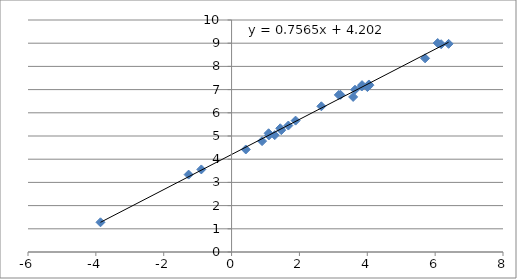
| Category | Series 0 |
|---|---|
| -3.863232841258714 | 1.281 |
| -1.2658482080440236 | 3.336 |
| -0.8915981192837836 | 3.558 |
| 1.091923300517313 | 5.118 |
| 0.41871033485818504 | 4.419 |
| 0.9001613499442714 | 4.779 |
| 1.2725655957915476 | 5.037 |
| 1.4655675420143985 | 5.252 |
| 1.673351238177753 | 5.451 |
| 1.0986122886681098 | 5.024 |
| 1.4350845252893227 | 5.333 |
| 1.8870696490323797 | 5.663 |
| 2.6461747973841225 | 6.28 |
| 3.2108436531709366 | 6.774 |
| 3.1612467120315646 | 6.771 |
| 3.58351893845611 | 6.685 |
| 3.6375861597263857 | 6.994 |
| 3.8372994592322094 | 7.134 |
| 3.845883202923601 | 7.193 |
| 4.046553898385752 | 7.221 |
| 4.00369019395397 | 7.11 |
| 4.05871738457895 | 7.185 |
| 5.703782474656201 | 8.348 |
| 6.075346031088684 | 9.008 |
| 6.1779441140506 | 8.956 |
| 6.396929655216146 | 8.972 |